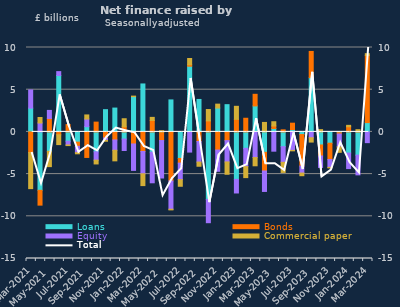
| Category | Loans | Bonds | Equity | Commercial paper |
|---|---|---|---|---|
| Mar-2021 | 2.817 | -2.452 | 2.151 | -4.272 |
| Apr-2021 | -6.924 | -1.754 | 1.057 | 0.65 |
| May-2021 | -2.298 | 1.596 | 0.95 | -1.817 |
| Jun-2021 | 6.686 | -0.338 | 0.456 | -1.166 |
| Jul-2021 | -1.102 | 0.867 | -0.447 | -0.072 |
| Aug-2021 | -1.213 | -0.499 | -0.747 | -0.136 |
| Sep-2021 | 0.624 | -3.026 | 0.905 | 0.481 |
| Oct-2021 | -2.356 | 1.158 | -0.995 | -0.446 |
| Nov-2021 | 2.635 | -0.729 | -0.271 | -0.107 |
| Dec-2021 | 2.823 | -0.957 | -1.222 | -1.25 |
| Jan-2022 | -0.85 | 0.598 | -1.351 | 0.961 |
| Feb-2022 | 4.183 | -1.431 | -3.129 | 0.058 |
| Mar-2022 | 5.681 | -2.323 | -2.637 | -1.403 |
| Apr-2022 | -2.408 | 1.362 | -3.621 | 0.359 |
| May-2022 | -0.081 | -0.942 | -4.44 | 0.142 |
| Jun-2022 | 3.789 | -5.816 | -3.344 | -0.081 |
| Jul-2022 | -3.145 | -0.555 | -1.953 | -0.789 |
| Aug-2022 | 7.782 | 0.173 | -2.391 | 0.742 |
| Sep-2022 | 3.845 | -1.135 | -2.44 | -0.495 |
| Oct-2022 | -8.008 | 1.304 | -2.75 | 1.347 |
| Nov-2022 | 2.828 | -2.15 | -2.516 | 0.46 |
| Dec-2022 | 3.227 | -1.032 | -2.53 | -1.457 |
| Jan-2023 | -5.626 | 1.488 | -1.611 | 1.544 |
| Feb-2023 | -1.948 | 1.616 | -2.163 | -1.306 |
| Mar-2023 | 3.078 | 1.375 | -3.042 | -0.973 |
| Apr-2023 | -2.421 | -2.212 | -2.422 | 1.122 |
| May-2023 | 0.403 | 0.298 | -2.284 | 0.503 |
| Jun-2023 | -1.751 | 0.244 | -1.854 | -1.198 |
| Jul-2023 | 0.279 | 0.754 | -2.191 | -0.052 |
| Aug-2023 | -0.315 | -3.733 | -0.829 | -0.312 |
| Sep-2023 | 6.423 | 3.109 | -0.694 | -0.512 |
| Oct-2023 | -1.549 | -1.306 | -1.354 | 0.267 |
| Nov-2023 | -1.341 | -1.935 | -0.926 | -0.066 |
| Dec-2023 | -0.094 | -0.156 | -1.515 | -0.653 |
| Jan-2024 | -2.509 | 0.609 | -1.838 | 0.167 |
| Feb-2024 | -2.753 | 0.021 | -2.338 | 0.241 |
| Mar-2024 | 1.101 | 7.96 | -1.274 | 0.208 |